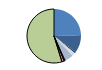
| Category | Series 0 |
|---|---|
| ARRASTRE | 348 |
| CERCO | 149 |
| ATUNEROS CAÑEROS | 13 |
| PALANGRE DE FONDO | 30 |
| PALANGRE DE SUPERFICIE | 64 |
| RASCO | 9 |
| VOLANTA | 8 |
| ARTES FIJAS | 20 |
| ARTES MENORES | 776 |